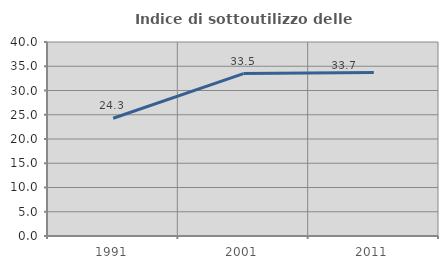
| Category | Indice di sottoutilizzo delle abitazioni  |
|---|---|
| 1991.0 | 24.286 |
| 2001.0 | 33.49 |
| 2011.0 | 33.704 |